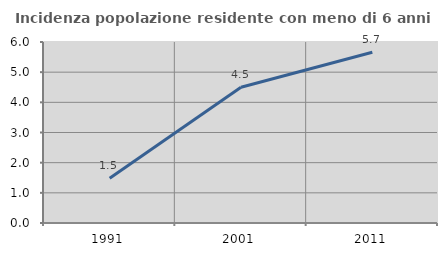
| Category | Incidenza popolazione residente con meno di 6 anni |
|---|---|
| 1991.0 | 1.485 |
| 2001.0 | 4.5 |
| 2011.0 | 5.66 |